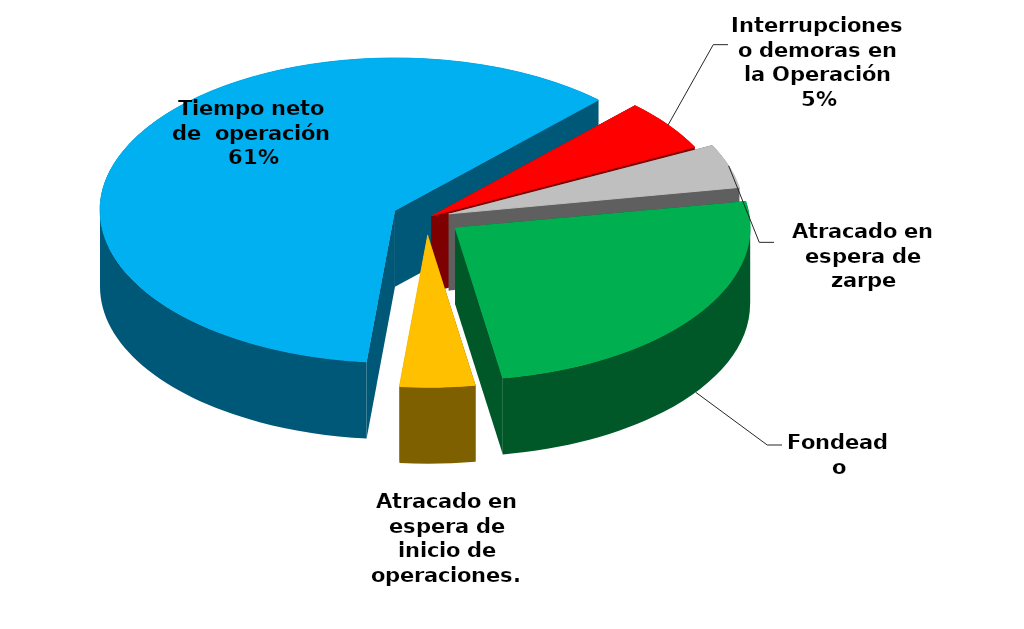
| Category | Series 0 |
|---|---|
| Fondeado | 16461.566 |
| Atracado en espera de inicio de operaciones. | 2690.244 |
| Tiempo neto de  operación | 39578.318 |
| Interrupciones o demoras en la Operación | 3557.95 |
| Atracado en espera de zarpe | 3051.563 |